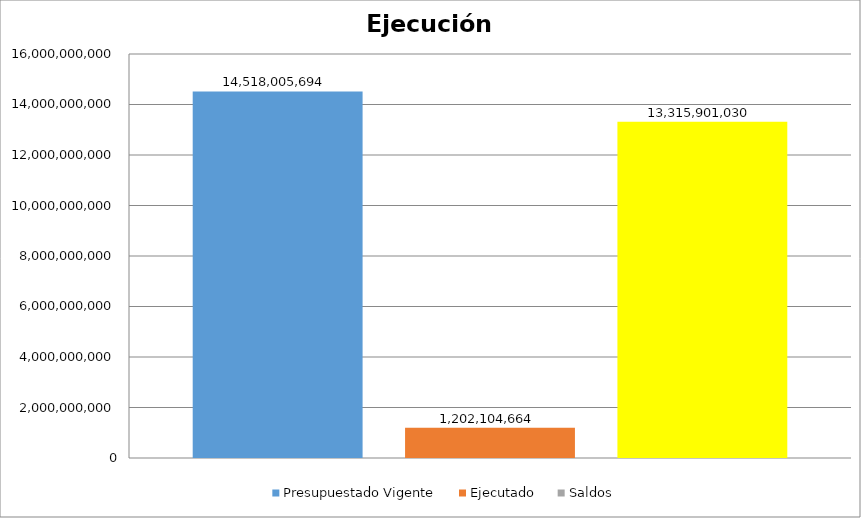
| Category | Presupuestado Vigente | Ejecutado | Saldos |
|---|---|---|---|
| 0 | 14518005694 | 1202104664 | 13315901030 |